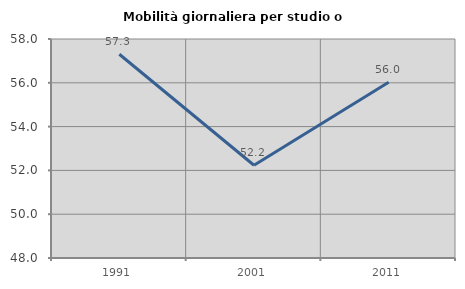
| Category | Mobilità giornaliera per studio o lavoro |
|---|---|
| 1991.0 | 57.304 |
| 2001.0 | 52.236 |
| 2011.0 | 56.022 |